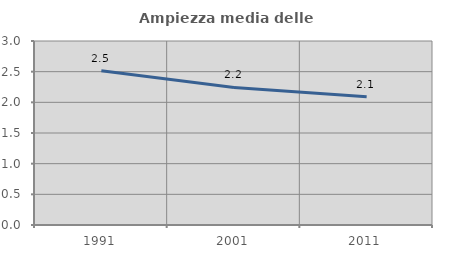
| Category | Ampiezza media delle famiglie |
|---|---|
| 1991.0 | 2.514 |
| 2001.0 | 2.243 |
| 2011.0 | 2.092 |